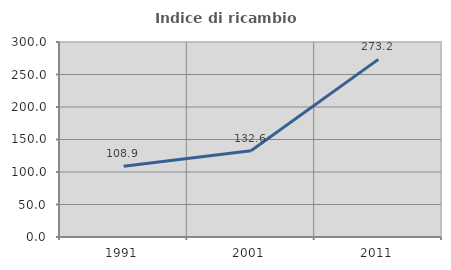
| Category | Indice di ricambio occupazionale  |
|---|---|
| 1991.0 | 108.864 |
| 2001.0 | 132.573 |
| 2011.0 | 273.244 |